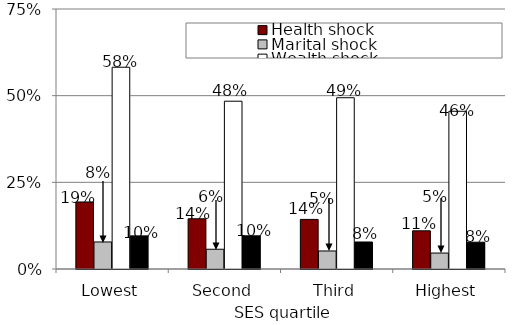
| Category | Health shock | Marital shock | Wealth shock | Employment shock |
|---|---|---|---|---|
| Lowest | 0.193 | 0.078 | 0.582 | 0.096 |
| Second | 0.145 | 0.057 | 0.484 | 0.096 |
| Third | 0.143 | 0.052 | 0.494 | 0.078 |
| Highest | 0.11 | 0.046 | 0.455 | 0.077 |